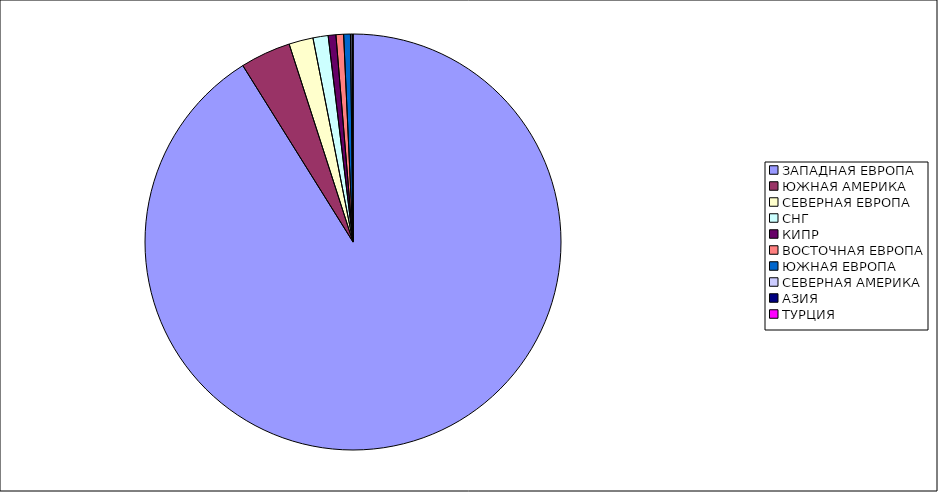
| Category | Оборот |
|---|---|
| ЗАПАДНАЯ ЕВРОПА | 0.911 |
| ЮЖНАЯ АМЕРИКА | 0.039 |
| СЕВЕРНАЯ ЕВРОПА | 0.019 |
| СНГ | 0.012 |
| КИПР | 0.006 |
| ВОСТОЧНАЯ ЕВРОПА | 0.006 |
| ЮЖНАЯ ЕВРОПА | 0.005 |
| СЕВЕРНАЯ АМЕРИКА | 0.001 |
| АЗИЯ | 0.001 |
| ТУРЦИЯ | 0 |